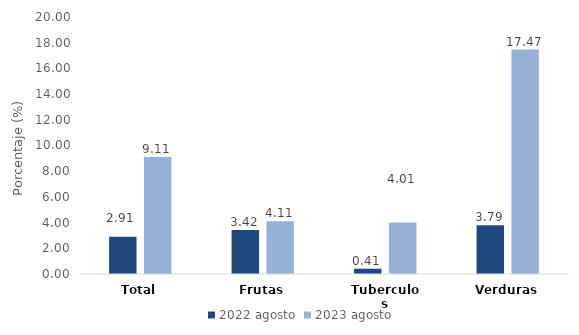
| Category | 2022 | 2023 |
|---|---|---|
| Total | 2.909 | 9.109 |
| Frutas | 3.422 | 4.108 |
| Tuberculos | 0.411 | 4.013 |
| Verduras | 3.789 | 17.466 |